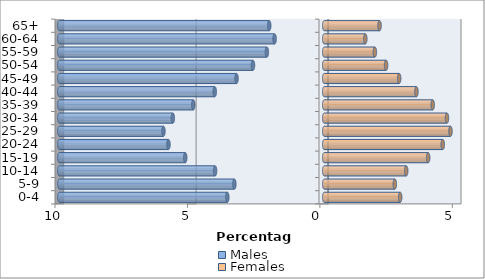
| Category | Males | Females |
|---|---|---|
| 0-4 | -3.659 | 2.867 |
| 5-9 | -3.393 | 2.665 |
| 10-14 | -4.121 | 3.095 |
| 15-19 | -5.247 | 3.925 |
| 20-24 | -5.88 | 4.475 |
| 25-29 | -6.07 | 4.766 |
| 30-34 | -5.716 | 4.633 |
| 35-39 | -4.944 | 4.095 |
| 40-44 | -4.133 | 3.481 |
| 45-49 | -3.311 | 2.829 |
| 50-54 | -2.69 | 2.336 |
| 55-59 | -2.165 | 1.912 |
| 60-64 | -1.874 | 1.551 |
| 65+ | -2.076 | 2.089 |